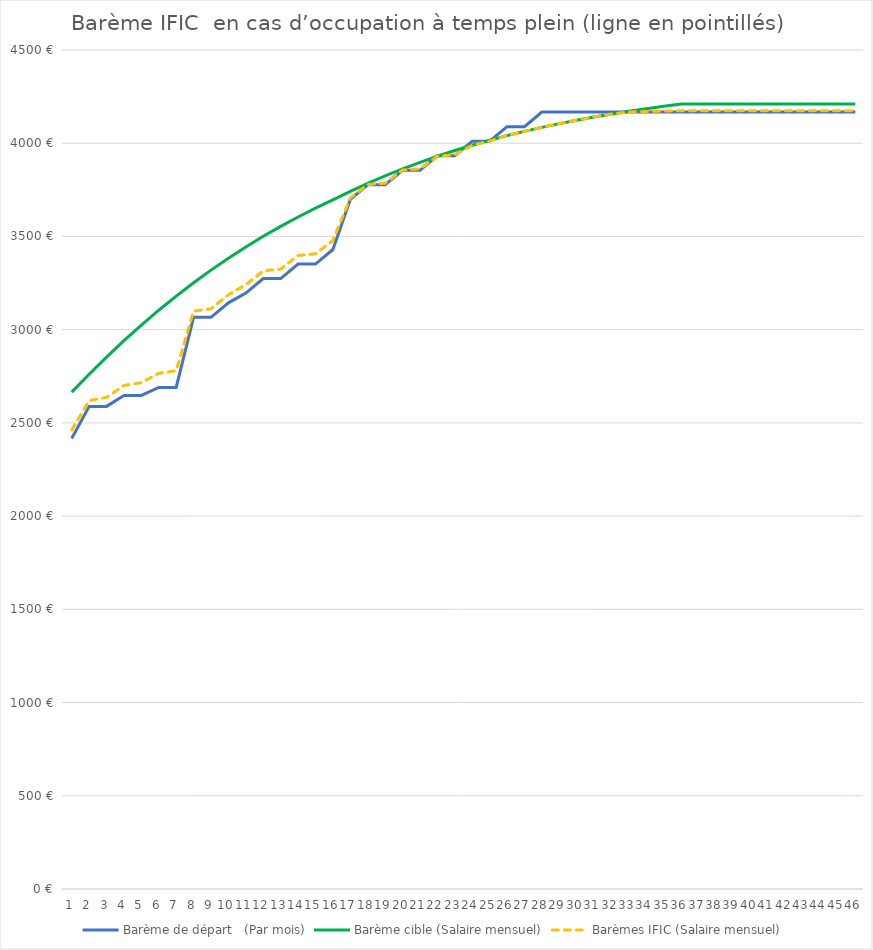
| Category | Barème de départ   | Barème cible | Barèmes IFIC |
|---|---|---|---|
| 0 | 2416.31 | 2665.01 | 2461.7 |
| 1 | 2588.47 | 2760.95 | 2619.95 |
| 2 | 2588.47 | 2852.89 | 2636.73 |
| 3 | 2647.27 | 2940.76 | 2700.83 |
| 4 | 2647.27 | 3024.56 | 2716.13 |
| 5 | 2690.27 | 3104.27 | 2765.83 |
| 6 | 2690.27 | 3179.94 | 2779.63 |
| 7 | 3065.95 | 3251.65 | 3099.84 |
| 8 | 3065.95 | 3319.48 | 3112.22 |
| 9 | 3143.97 | 3383.52 | 3187.69 |
| 10 | 3195.97 | 3443.92 | 3241.22 |
| 11 | 3273.99 | 3500.77 | 3315.38 |
| 12 | 3273.99 | 3554.23 | 3325.13 |
| 13 | 3352 | 3604.44 | 3398.07 |
| 14 | 3352 | 3651.53 | 3406.66 |
| 15 | 3430.02 | 3695.66 | 3478.5 |
| 16 | 3698.75 | 3741.57 | 3706.56 |
| 17 | 3776.77 | 3784.56 | 3778.19 |
| 18 | 3776.77 | 3824.79 | 3785.53 |
| 19 | 3854.78 | 3862.38 | 3856.17 |
| 20 | 3854.78 | 3897.51 | 3862.58 |
| 21 | 3932.8 | 3930.29 | 3930.29 |
| 22 | 3932.8 | 3960.88 | 3937.92 |
| 23 | 4010.82 | 3989.38 | 3989.38 |
| 24 | 4010.82 | 4015.94 | 4011.75 |
| 25 | 4088.83 | 4040.68 | 4040.68 |
| 26 | 4088.83 | 4063.7 | 4063.7 |
| 27 | 4166.85 | 4085.11 | 4085.11 |
| 28 | 4166.85 | 4105.02 | 4105.02 |
| 29 | 4166.85 | 4123.52 | 4123.52 |
| 30 | 4166.85 | 4140.72 | 4140.72 |
| 31 | 4166.85 | 4156.69 | 4156.69 |
| 32 | 4166.85 | 4171.52 | 4167.7 |
| 33 | 4166.85 | 4185.29 | 4170.22 |
| 34 | 4166.85 | 4198.08 | 4172.55 |
| 35 | 4166.85 | 4209.93 | 4174.71 |
| 36 | 4166.85 | 4209.93 | 4174.71 |
| 37 | 4166.85 | 4209.93 | 4174.71 |
| 38 | 4166.85 | 4209.93 | 4174.71 |
| 39 | 4166.85 | 4209.93 | 4174.71 |
| 40 | 4166.85 | 4209.93 | 4174.71 |
| 41 | 4166.85 | 4209.93 | 4174.71 |
| 42 | 4166.85 | 4209.93 | 4174.71 |
| 43 | 4166.85 | 4209.93 | 4174.71 |
| 44 | 4166.85 | 4209.93 | 4174.71 |
| 45 | 4166.85 | 4209.93 | 4174.71 |